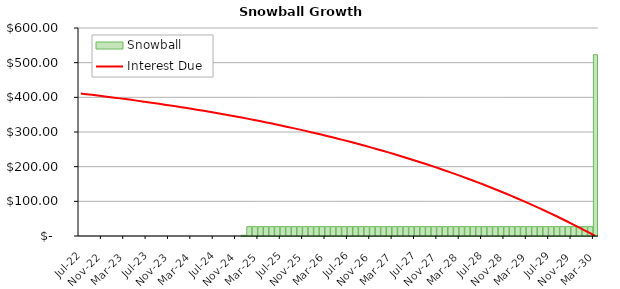
| Category | Snowball |
|---|---|
| 2022-07-01 | 0 |
| 2022-08-01 | 0 |
| 2022-09-01 | 0 |
| 2022-10-01 | 0 |
| 2022-11-01 | 0 |
| 2022-12-01 | 0 |
| 2023-01-01 | 0 |
| 2023-02-01 | 0 |
| 2023-03-01 | 0 |
| 2023-04-01 | 0 |
| 2023-05-01 | 0 |
| 2023-06-01 | 0 |
| 2023-07-01 | 0 |
| 2023-08-01 | 0 |
| 2023-09-01 | 0 |
| 2023-10-01 | 0 |
| 2023-11-01 | 0 |
| 2023-12-01 | 0 |
| 2024-01-01 | 0 |
| 2024-02-01 | 0 |
| 2024-03-01 | 0 |
| 2024-04-01 | 0 |
| 2024-05-01 | 0 |
| 2024-06-01 | 0 |
| 2024-07-01 | 0 |
| 2024-08-01 | 0 |
| 2024-09-01 | 0 |
| 2024-10-01 | 0 |
| 2024-11-01 | 0 |
| 2024-12-01 | 2.19 |
| 2025-01-01 | 27 |
| 2025-02-01 | 27 |
| 2025-03-01 | 27 |
| 2025-04-01 | 27 |
| 2025-05-01 | 27 |
| 2025-06-01 | 27 |
| 2025-07-01 | 27 |
| 2025-08-01 | 27 |
| 2025-09-01 | 27 |
| 2025-10-01 | 27 |
| 2025-11-01 | 27 |
| 2025-12-01 | 27 |
| 2026-01-01 | 27 |
| 2026-02-01 | 27 |
| 2026-03-01 | 27 |
| 2026-04-01 | 27 |
| 2026-05-01 | 27 |
| 2026-06-01 | 27 |
| 2026-07-01 | 27 |
| 2026-08-01 | 27 |
| 2026-09-01 | 27 |
| 2026-10-01 | 27 |
| 2026-11-01 | 27 |
| 2026-12-01 | 27 |
| 2027-01-01 | 27 |
| 2027-02-01 | 27 |
| 2027-03-01 | 27 |
| 2027-04-01 | 27 |
| 2027-05-01 | 27 |
| 2027-06-01 | 27 |
| 2027-07-01 | 27 |
| 2027-08-01 | 27 |
| 2027-09-01 | 27 |
| 2027-10-01 | 27 |
| 2027-11-01 | 27 |
| 2027-12-01 | 27 |
| 2028-01-01 | 27 |
| 2028-02-01 | 27 |
| 2028-03-01 | 27 |
| 2028-04-01 | 27 |
| 2028-05-01 | 27 |
| 2028-06-01 | 27 |
| 2028-07-01 | 27 |
| 2028-08-01 | 27 |
| 2028-09-01 | 27 |
| 2028-10-01 | 27 |
| 2028-11-01 | 27 |
| 2028-12-01 | 27 |
| 2029-01-01 | 27 |
| 2029-02-01 | 27 |
| 2029-03-01 | 27 |
| 2029-04-01 | 27 |
| 2029-05-01 | 27 |
| 2029-06-01 | 27 |
| 2029-07-01 | 27 |
| 2029-08-01 | 27 |
| 2029-09-01 | 27 |
| 2029-10-01 | 27 |
| 2029-11-01 | 27 |
| 2029-12-01 | 27 |
| 2030-01-01 | 27 |
| 2030-02-01 | 27 |
| 2030-03-01 | 522.83 |
| #N/A | 0 |
| #N/A | 0 |
| #N/A | 0 |
| #N/A | 0 |
| #N/A | 0 |
| #N/A | 0 |
| #N/A | 0 |
| #N/A | 0 |
| #N/A | 0 |
| #N/A | 0 |
| #N/A | 0 |
| #N/A | 0 |
| #N/A | 0 |
| #N/A | 0 |
| #N/A | 0 |
| #N/A | 0 |
| #N/A | 0 |
| #N/A | 0 |
| #N/A | 0 |
| #N/A | 0 |
| #N/A | 0 |
| #N/A | 0 |
| #N/A | 0 |
| #N/A | 0 |
| #N/A | 0 |
| #N/A | 0 |
| #N/A | 0 |
| #N/A | 0 |
| #N/A | 0 |
| #N/A | 0 |
| #N/A | 0 |
| #N/A | 0 |
| #N/A | 0 |
| #N/A | 0 |
| #N/A | 0 |
| #N/A | 0 |
| #N/A | 0 |
| #N/A | 0 |
| #N/A | 0 |
| #N/A | 0 |
| #N/A | 0 |
| #N/A | 0 |
| #N/A | 0 |
| #N/A | 0 |
| #N/A | 0 |
| #N/A | 0 |
| #N/A | 0 |
| #N/A | 0 |
| #N/A | 0 |
| #N/A | 0 |
| #N/A | 0 |
| #N/A | 0 |
| #N/A | 0 |
| #N/A | 0 |
| #N/A | 0 |
| #N/A | 0 |
| #N/A | 0 |
| #N/A | 0 |
| #N/A | 0 |
| #N/A | 0 |
| #N/A | 0 |
| #N/A | 0 |
| #N/A | 0 |
| #N/A | 0 |
| #N/A | 0 |
| #N/A | 0 |
| #N/A | 0 |
| #N/A | 0 |
| #N/A | 0 |
| #N/A | 0 |
| #N/A | 0 |
| #N/A | 0 |
| #N/A | 0 |
| #N/A | 0 |
| #N/A | 0 |
| #N/A | 0 |
| #N/A | 0 |
| #N/A | 0 |
| #N/A | 0 |
| #N/A | 0 |
| #N/A | 0 |
| #N/A | 0 |
| #N/A | 0 |
| #N/A | 0 |
| #N/A | 0 |
| #N/A | 0 |
| #N/A | 0 |
| #N/A | 0 |
| #N/A | 0 |
| #N/A | 0 |
| #N/A | 0 |
| #N/A | 0 |
| #N/A | 0 |
| #N/A | 0 |
| #N/A | 0 |
| #N/A | 0 |
| #N/A | 0 |
| #N/A | 0 |
| #N/A | 0 |
| #N/A | 0 |
| #N/A | 0 |
| #N/A | 0 |
| #N/A | 0 |
| #N/A | 0 |
| #N/A | 0 |
| #N/A | 0 |
| #N/A | 0 |
| #N/A | 0 |
| #N/A | 0 |
| #N/A | 0 |
| #N/A | 0 |
| #N/A | 0 |
| #N/A | 0 |
| #N/A | 0 |
| #N/A | 0 |
| #N/A | 0 |
| #N/A | 0 |
| #N/A | 0 |
| #N/A | 0 |
| #N/A | 0 |
| #N/A | 0 |
| #N/A | 0 |
| #N/A | 0 |
| #N/A | 0 |
| #N/A | 0 |
| #N/A | 0 |
| #N/A | 0 |
| #N/A | 0 |
| #N/A | 0 |
| #N/A | 0 |
| #N/A | 0 |
| #N/A | 0 |
| #N/A | 0 |
| #N/A | 0 |
| #N/A | 0 |
| #N/A | 0 |
| #N/A | 0 |
| #N/A | 0 |
| #N/A | 0 |
| #N/A | 0 |
| #N/A | 0 |
| #N/A | 0 |
| #N/A | 0 |
| #N/A | 0 |
| #N/A | 0 |
| #N/A | 0 |
| #N/A | 0 |
| #N/A | 0 |
| #N/A | 0 |
| #N/A | 0 |
| #N/A | 0 |
| #N/A | 0 |
| #N/A | 0 |
| #N/A | 0 |
| #N/A | 0 |
| #N/A | 0 |
| #N/A | 0 |
| #N/A | 0 |
| #N/A | 0 |
| #N/A | 0 |
| #N/A | 0 |
| #N/A | 0 |
| #N/A | 0 |
| #N/A | 0 |
| #N/A | 0 |
| #N/A | 0 |
| #N/A | 0 |
| #N/A | 0 |
| #N/A | 0 |
| #N/A | 0 |
| #N/A | 0 |
| #N/A | 0 |
| #N/A | 0 |
| #N/A | 0 |
| #N/A | 0 |
| #N/A | 0 |
| #N/A | 0 |
| #N/A | 0 |
| #N/A | 0 |
| #N/A | 0 |
| #N/A | 0 |
| #N/A | 0 |
| #N/A | 0 |
| #N/A | 0 |
| #N/A | 0 |
| #N/A | 0 |
| #N/A | 0 |
| #N/A | 0 |
| #N/A | 0 |
| #N/A | 0 |
| #N/A | 0 |
| #N/A | 0 |
| #N/A | 0 |
| #N/A | 0 |
| #N/A | 0 |
| #N/A | 0 |
| #N/A | 0 |
| #N/A | 0 |
| #N/A | 0 |
| #N/A | 0 |
| #N/A | 0 |
| #N/A | 0 |
| #N/A | 0 |
| #N/A | 0 |
| #N/A | 0 |
| #N/A | 0 |
| #N/A | 0 |
| #N/A | 0 |
| #N/A | 0 |
| #N/A | 0 |
| #N/A | 0 |
| #N/A | 0 |
| #N/A | 0 |
| #N/A | 0 |
| #N/A | 0 |
| #N/A | 0 |
| #N/A | 0 |
| #N/A | 0 |
| #N/A | 0 |
| #N/A | 0 |
| #N/A | 0 |
| #N/A | 0 |
| #N/A | 0 |
| #N/A | 0 |
| #N/A | 0 |
| #N/A | 0 |
| #N/A | 0 |
| #N/A | 0 |
| #N/A | 0 |
| #N/A | 0 |
| #N/A | 0 |
| #N/A | 0 |
| #N/A | 0 |
| #N/A | 0 |
| #N/A | 0 |
| #N/A | 0 |
| #N/A | 0 |
| #N/A | 0 |
| #N/A | 0 |
| #N/A | 0 |
| #N/A | 0 |
| #N/A | 0 |
| #N/A | 0 |
| #N/A | 0 |
| #N/A | 0 |
| #N/A | 0 |
| #N/A | 0 |
| #N/A | 0 |
| #N/A | 0 |
| #N/A | 0 |
| #N/A | 0 |
| #N/A | 0 |
| #N/A | 0 |
| #N/A | 0 |
| #N/A | 0 |
| #N/A | 0 |
| #N/A | 0 |
| #N/A | 0 |
| #N/A | 0 |
| #N/A | 0 |
| #N/A | 0 |
| #N/A | 0 |
| #N/A | 0 |
| #N/A | 0 |
| #N/A | 0 |
| #N/A | 0 |
| #N/A | 0 |